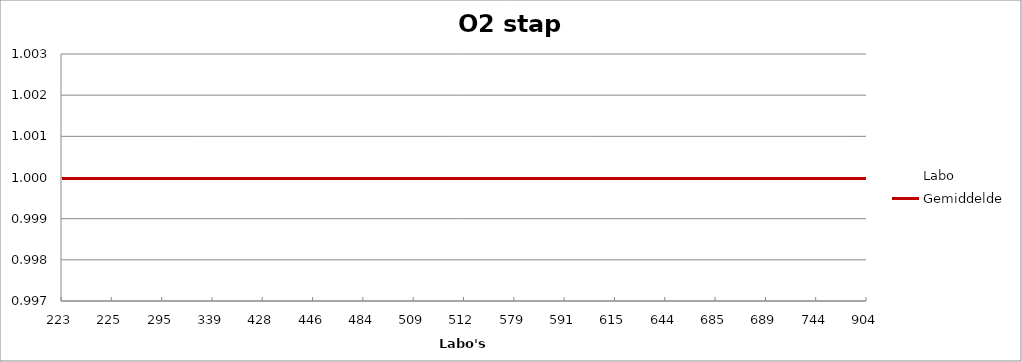
| Category | Labo | Gemiddelde |
|---|---|---|
| 223.0 | 1.001 | 1 |
| 225.0 | 1 | 1 |
| 295.0 | 1 | 1 |
| 339.0 | 1.001 | 1 |
| 428.0 | 1 | 1 |
| 446.0 | 0.999 | 1 |
| 484.0 | 1.001 | 1 |
| 509.0 | 1 | 1 |
| 512.0 | 1 | 1 |
| 579.0 | 1 | 1 |
| 591.0 | 1 | 1 |
| 615.0 | 1 | 1 |
| 644.0 | 1 | 1 |
| 685.0 | 1 | 1 |
| 689.0 | 1.001 | 1 |
| 744.0 | 1 | 1 |
| 904.0 | 1 | 1 |